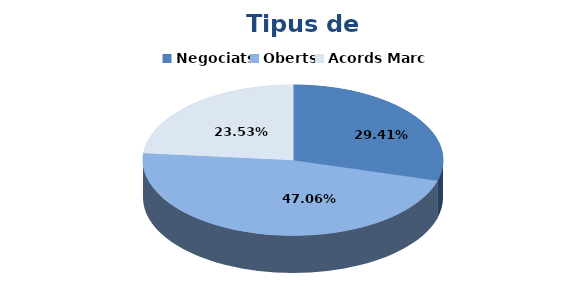
| Category | Series 0 |
|---|---|
| Negociats | 5 |
| Oberts | 8 |
| Acords Marc | 4 |